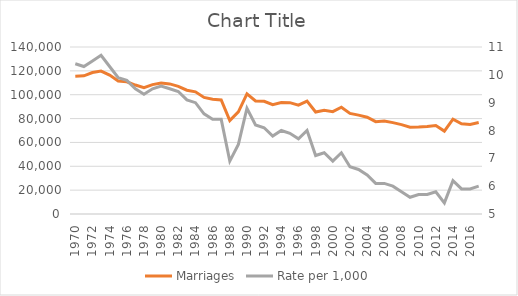
| Category | Marriages |
|---|---|
| 1970.0 | 115478 |
| 1971.0 | 115826 |
| 1972.0 | 118592 |
| 1973.0 | 119843 |
| 1974.0 | 116419 |
| 1975.0 | 111459 |
| 1976.0 | 110847 |
| 1977.0 | 108100 |
| 1978.0 | 105946 |
| 1979.0 | 108480 |
| 1980.0 | 109823 |
| 1981.0 | 109074 |
| 1982.0 | 107023 |
| 1983.0 | 103773 |
| 1984.0 | 102418 |
| 1985.0 | 97701 |
| 1986.0 | 96189 |
| 1987.0 | 95613 |
| 1988.0 | 78302 |
| 1989.0 | 85695 |
| 1990.0 | 100632 |
| 1991.0 | 94771 |
| 1992.0 | 94500 |
| 1993.0 | 91578 |
| 1994.0 | 93430 |
| 1995.0 | 93357 |
| 1996.0 | 91187 |
| 1997.0 | 94574 |
| 1998.0 | 85515 |
| 1999.0 | 86961 |
| 2000.0 | 85799 |
| 2001.0 | 89469 |
| 2002.0 | 84288 |
| 2003.0 | 82889 |
| 2004.0 | 81157 |
| 2005.0 | 77419 |
| 2006.0 | 77959 |
| 2007.0 | 76608 |
| 2008.0 | 74935 |
| 2009.0 | 72821 |
| 2010.0 | 72853 |
| 2011.0 | 73341 |
| 2012.0 | 74168 |
| 2013.0 | 69487 |
| 2014.0 | 79462 |
| 2015.0 | 75628 |
| 2016.0 | 75131 |
| 2017.0 | 76684 |